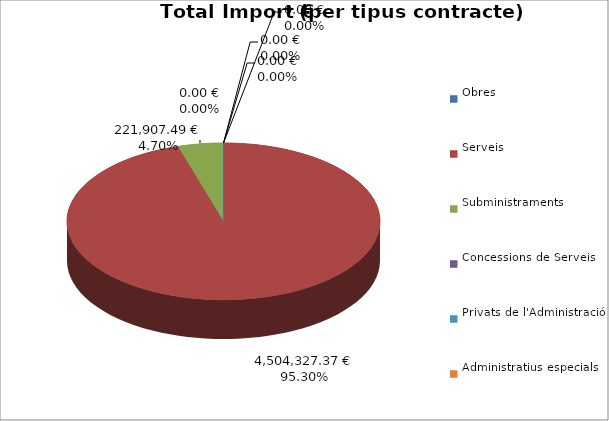
| Category | Total preu
(amb IVA) |
|---|---|
| Obres | 0 |
| Serveis | 4504327.373 |
| Subministraments | 221907.49 |
| Concessions de Serveis | 0 |
| Privats de l'Administració | 0 |
| Administratius especials | 0 |